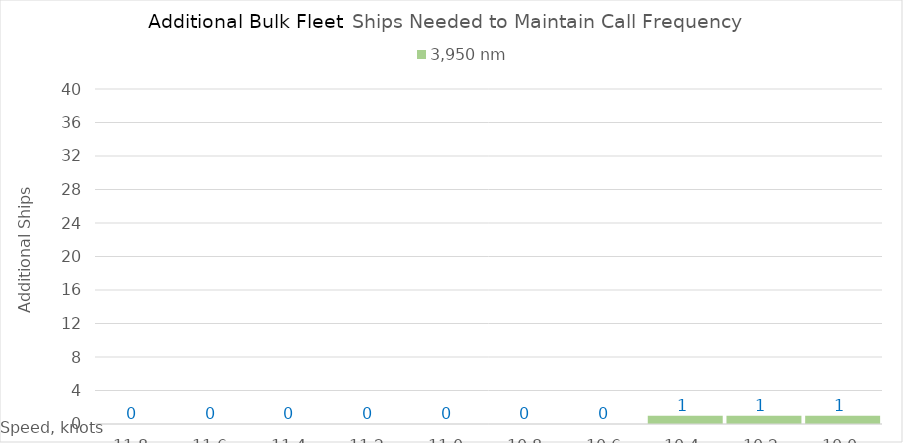
| Category | 3,950 |
|---|---|
| 11.8 | 0 |
| 11.600000000000001 | 0 |
| 11.400000000000002 | 0 |
| 11.200000000000003 | 0 |
| 11.000000000000004 | 0 |
| 10.800000000000004 | 0 |
| 10.600000000000005 | 0 |
| 10.400000000000006 | 1 |
| 10.200000000000006 | 1 |
| 10.000000000000007 | 1 |